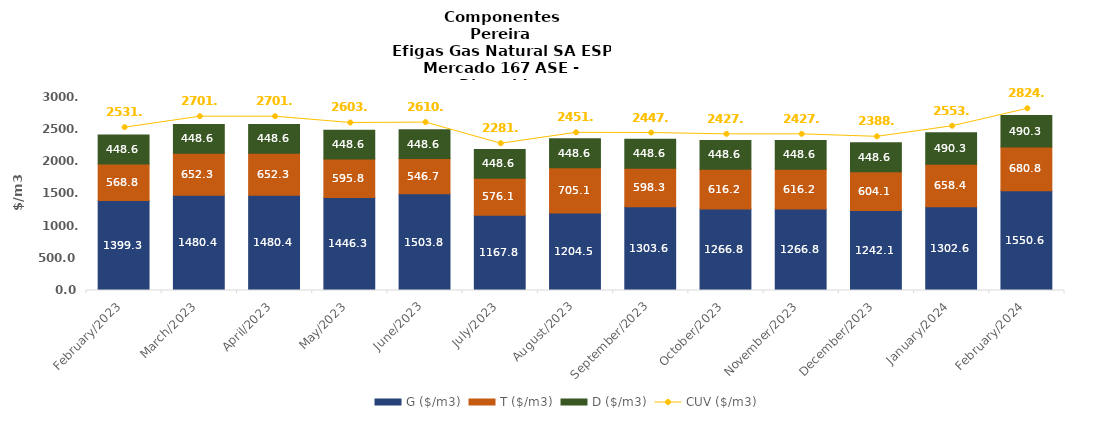
| Category | G ($/m3) | T ($/m3) | D ($/m3) |
|---|---|---|---|
| 2023-02-01 | 1399.342 | 568.805 | 448.635 |
| 2023-03-01 | 1480.39 | 652.25 | 448.635 |
| 2023-04-01 | 1480.39 | 652.25 | 448.635 |
| 2023-05-01 | 1446.347 | 595.782 | 448.635 |
| 2023-06-01 | 1503.75 | 546.731 | 448.635 |
| 2023-07-01 | 1167.85 | 576.067 | 448.635 |
| 2023-08-01 | 1204.533 | 705.123 | 448.635 |
| 2023-09-01 | 1303.571 | 598.275 | 448.635 |
| 2023-10-01 | 1266.828 | 616.197 | 448.635 |
| 2023-11-01 | 1266.828 | 616.197 | 448.635 |
| 2023-12-01 | 1242.144 | 604.124 | 448.635 |
| 2024-01-01 | 1302.583 | 658.407 | 490.269 |
| 2024-02-01 | 1550.602 | 680.767 | 490.269 |